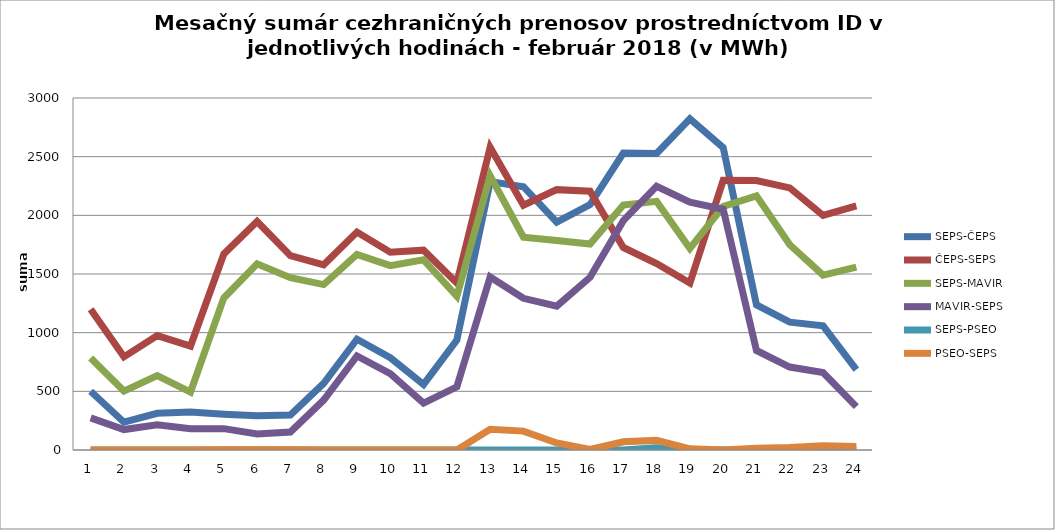
| Category | SEPS-ČEPS | ČEPS-SEPS | SEPS-MAVIR | MAVIR-SEPS | SEPS-PSEO | PSEO-SEPS |
|---|---|---|---|---|---|---|
| 1.0 | 501 | 1199 | 784 | 274 | 0 | 0 |
| 2.0 | 237 | 794 | 502 | 174 | 0 | 0 |
| 3.0 | 313 | 975 | 634 | 214 | 0 | 0 |
| 4.0 | 324 | 886 | 494 | 181 | 0 | 0 |
| 5.0 | 305 | 1670 | 1296 | 182 | 0 | 3 |
| 6.0 | 291 | 1948 | 1587 | 136 | 0 | 3 |
| 7.0 | 298 | 1657 | 1469 | 153 | 0 | 3 |
| 8.0 | 568 | 1578 | 1410 | 425 | 0 | 0 |
| 9.0 | 944 | 1857 | 1666 | 801 | 0 | 0 |
| 10.0 | 787 | 1686 | 1571 | 650 | 0 | 0 |
| 11.0 | 559 | 1703 | 1621 | 399 | 0 | 0 |
| 12.0 | 937 | 1424 | 1310 | 538 | 0 | 0 |
| 13.0 | 2287 | 2580 | 2337 | 1475 | 0 | 176 |
| 14.0 | 2244 | 2087 | 1813 | 1293 | 0 | 161 |
| 15.0 | 1942 | 2219 | 1786 | 1226 | 0 | 60 |
| 16.0 | 2092 | 2206 | 1756 | 1472 | 0 | 5 |
| 17.0 | 2531 | 1726 | 2088 | 1955 | 0 | 70 |
| 18.0 | 2527 | 1589 | 2119 | 2247 | 20 | 82 |
| 19.0 | 2822 | 1423 | 1718 | 2112 | 0 | 10 |
| 20.0 | 2577 | 2298 | 2075 | 2052 | 0 | 0 |
| 21.0 | 1237 | 2297 | 2166 | 848 | 0 | 14 |
| 22.0 | 1090 | 2234 | 1749 | 707 | 0 | 21 |
| 23.0 | 1058 | 2000 | 1490 | 661 | 0 | 36 |
| 24.0 | 685 | 2080 | 1558 | 370 | 0 | 29 |